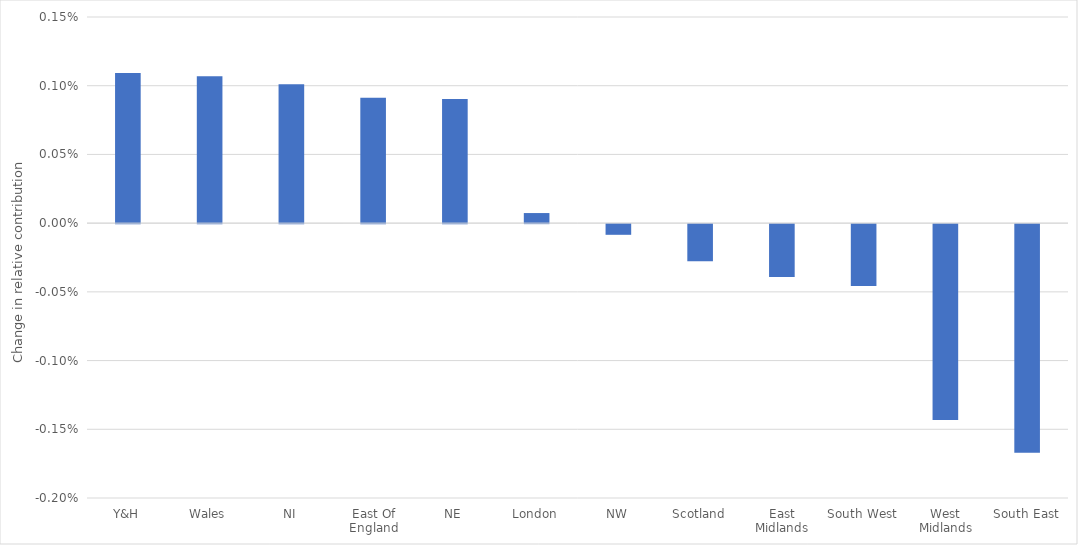
| Category | Change 2009 to 2017 |
|---|---|
| Y&H | 0.001 |
| Wales | 0.001 |
| NI | 0.001 |
| East Of England | 0.001 |
| NE | 0.001 |
| London | 0 |
| NW | 0 |
| Scotland | 0 |
| East Midlands | 0 |
| South West | 0 |
| West Midlands | -0.001 |
| South East | -0.002 |